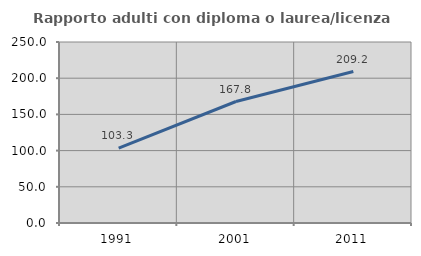
| Category | Rapporto adulti con diploma o laurea/licenza media  |
|---|---|
| 1991.0 | 103.297 |
| 2001.0 | 167.816 |
| 2011.0 | 209.195 |